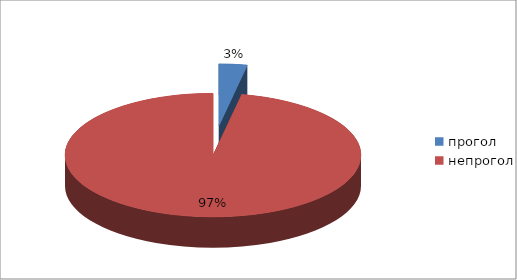
| Category | Series 0 |
|---|---|
| прогол | 2 |
| непрогол | 63 |